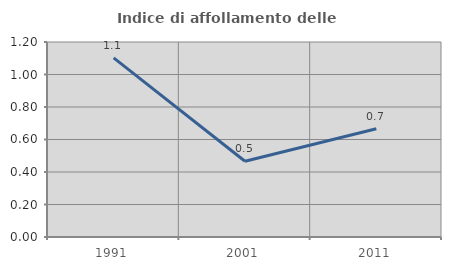
| Category | Indice di affollamento delle abitazioni  |
|---|---|
| 1991.0 | 1.102 |
| 2001.0 | 0.466 |
| 2011.0 | 0.666 |